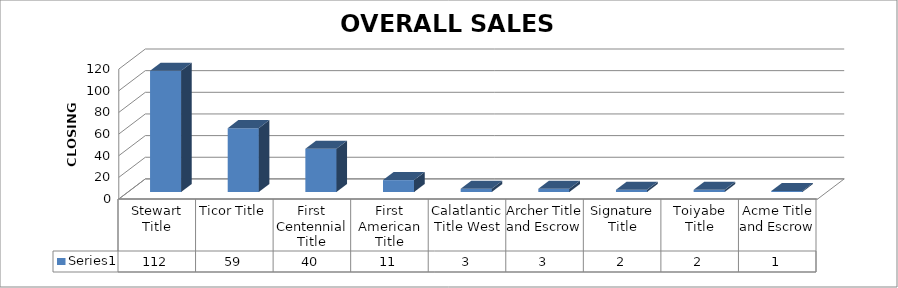
| Category | Series 0 |
|---|---|
| Stewart Title | 112 |
| Ticor Title | 59 |
| First Centennial Title | 40 |
| First American Title | 11 |
| Calatlantic Title West | 3 |
| Archer Title and Escrow | 3 |
| Signature Title | 2 |
| Toiyabe Title | 2 |
| Acme Title and Escrow | 1 |